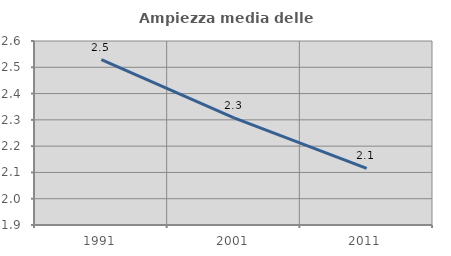
| Category | Ampiezza media delle famiglie |
|---|---|
| 1991.0 | 2.529 |
| 2001.0 | 2.308 |
| 2011.0 | 2.115 |